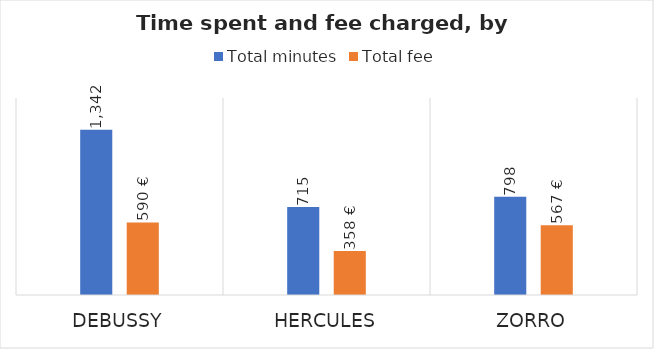
| Category | Total minutes | Total fee |
|---|---|---|
| Debussy | 1342 | 589.5 |
| Hercules | 715 | 357.5 |
| Zorro | 798 | 567 |